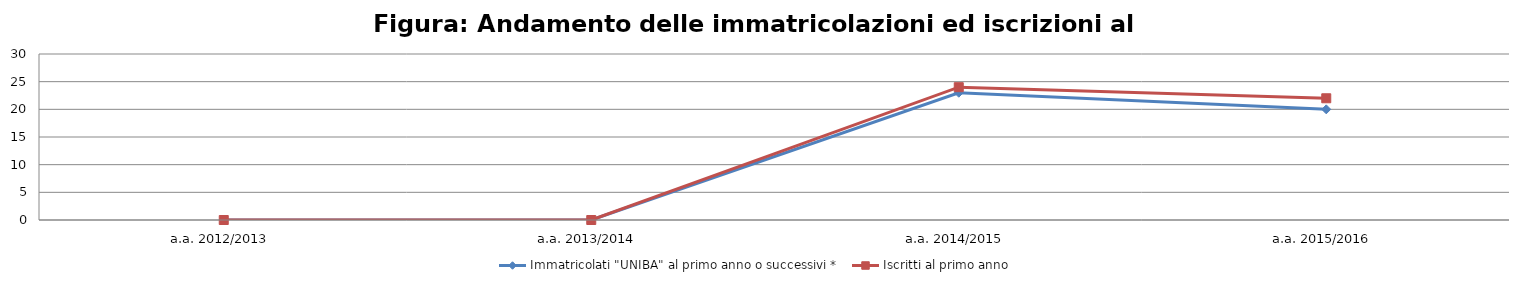
| Category | Immatricolati "UNIBA" al primo anno o successivi * | Iscritti al primo anno  |
|---|---|---|
| a.a. 2012/2013 | 0 | 0 |
| a.a. 2013/2014 | 0 | 0 |
| a.a. 2014/2015 | 23 | 24 |
| a.a. 2015/2016 | 20 | 22 |